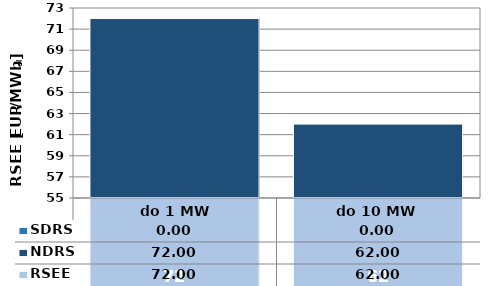
| Category | NDRS | SDRS |
|---|---|---|
|  do 1 MW | 72 | 0 |
| do 10 MW | 62 | 0 |